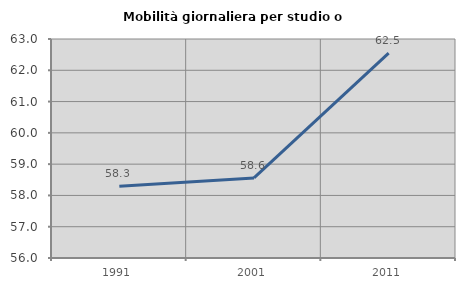
| Category | Mobilità giornaliera per studio o lavoro |
|---|---|
| 1991.0 | 58.293 |
| 2001.0 | 58.558 |
| 2011.0 | 62.547 |